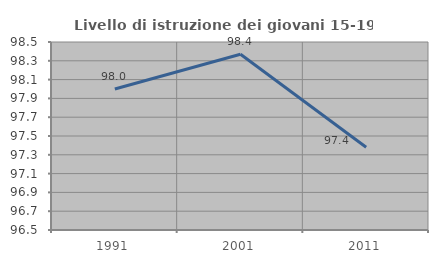
| Category | Livello di istruzione dei giovani 15-19 anni |
|---|---|
| 1991.0 | 98 |
| 2001.0 | 98.37 |
| 2011.0 | 97.38 |